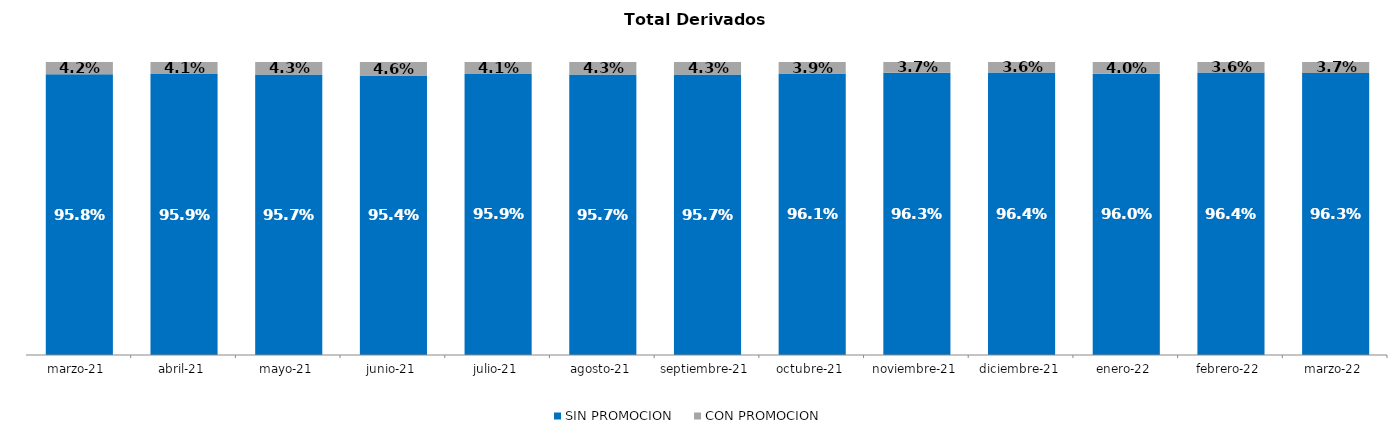
| Category | SIN PROMOCION   | CON PROMOCION   |
|---|---|---|
| 2021-03-01 | 0.958 | 0.042 |
| 2021-04-01 | 0.959 | 0.041 |
| 2021-05-01 | 0.957 | 0.043 |
| 2021-06-01 | 0.954 | 0.046 |
| 2021-07-01 | 0.959 | 0.041 |
| 2021-08-01 | 0.957 | 0.043 |
| 2021-09-01 | 0.957 | 0.043 |
| 2021-10-01 | 0.961 | 0.039 |
| 2021-11-01 | 0.963 | 0.037 |
| 2021-12-01 | 0.964 | 0.036 |
| 2022-01-01 | 0.96 | 0.04 |
| 2022-02-01 | 0.964 | 0.036 |
| 2022-03-01 | 0.963 | 0.037 |